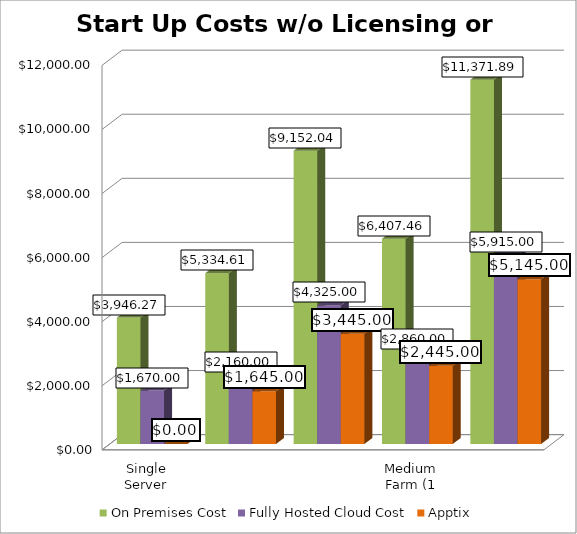
| Category | On Premises Cost | Fully Hosted Cloud Cost | Apptix |
|---|---|---|---|
| Single Server Install (WFE and SQL on 1 VM) | 3946.269 | 1670 | 0 |
| Small Farm - Two Server Install (WFE and SQL) | 5334.608 | 2160 | 1645 |
| Small Farm w/ High Availability (2 WFE - 2 SQL) | 9152.043 | 4325 | 3445 |
| Medium Farm (1 WFE, 1 App/Index, 1 SQL) | 6407.455 | 2860 | 2445 |
| Medium Farm w/ High Availability (2 WFE, 2 A/I, 2 SQL) | 11371.894 | 5915 | 5145 |